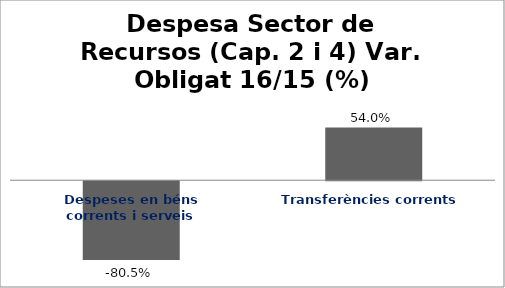
| Category | Series 0 |
|---|---|
| Despeses en béns corrents i serveis | -0.805 |
| Transferències corrents | 0.54 |